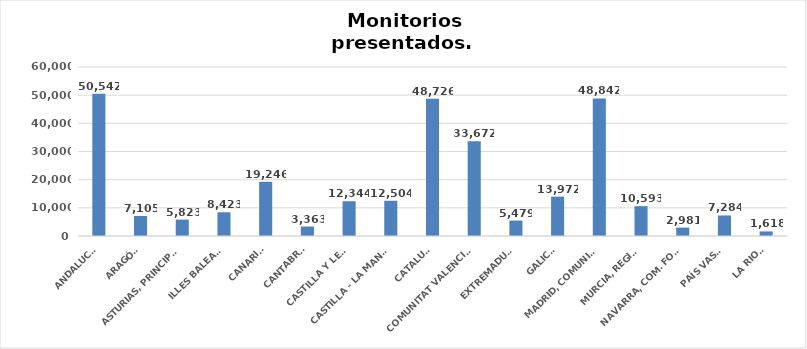
| Category | Series 0 |
|---|---|
| ANDALUCÍA | 50542 |
| ARAGÓN | 7105 |
| ASTURIAS, PRINCIPADO | 5823 |
| ILLES BALEARS | 8423 |
| CANARIAS | 19246 |
| CANTABRIA | 3363 |
| CASTILLA Y LEÓN | 12344 |
| CASTILLA - LA MANCHA | 12504 |
| CATALUÑA | 48726 |
| COMUNITAT VALENCIANA | 33672 |
| EXTREMADURA | 5479 |
| GALICIA | 13972 |
| MADRID, COMUNIDAD | 48842 |
| MURCIA, REGIÓN | 10593 |
| NAVARRA, COM. FORAL | 2981 |
| PAÍS VASCO | 7284 |
| LA RIOJA | 1618 |